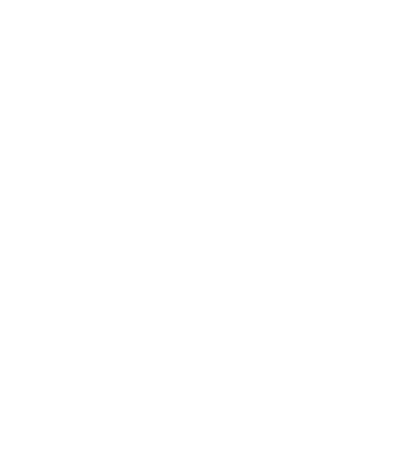
| Category | Total |
|---|---|
| Other 1 | 0 |
| Other 2 | 0 |
| Cash Reserves | 5000 |
| Savings/Investment | 6000 |
| 401(k)/Etc | 12000 |